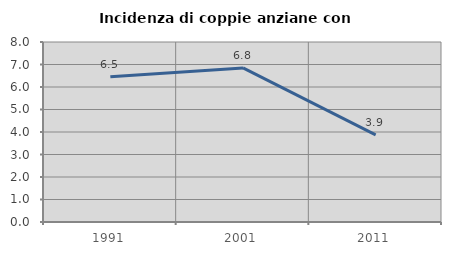
| Category | Incidenza di coppie anziane con figli |
|---|---|
| 1991.0 | 6.452 |
| 2001.0 | 6.849 |
| 2011.0 | 3.871 |